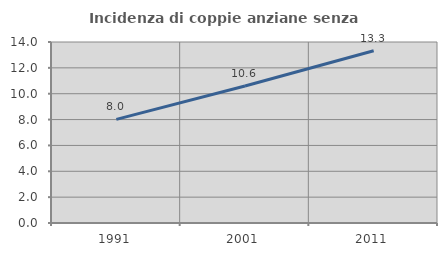
| Category | Incidenza di coppie anziane senza figli  |
|---|---|
| 1991.0 | 8.017 |
| 2001.0 | 10.595 |
| 2011.0 | 13.325 |